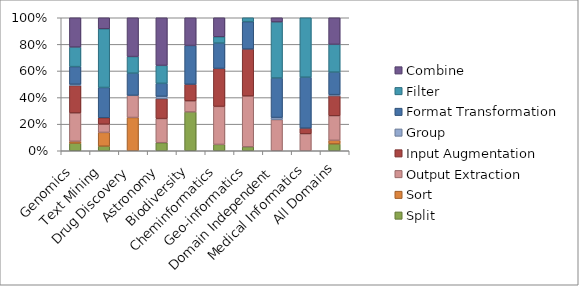
| Category | Split | Sort | Output Extraction | Input Augmentation | Group | Format Transformation | Filter | Combine |
|---|---|---|---|---|---|---|---|---|
| Genomics | 24 | 6 | 90 | 87 | 4 | 56 | 62 | 93 |
| Text Mining | 5 | 15 | 9 | 7 | 0 | 33 | 64 | 12 |
| Drug Discovery | 0 | 6 | 4 | 0 | 0 | 4 | 3 | 7 |
| Astronomy | 13 | 0 | 39 | 32 | 4 | 21 | 29 | 77 |
| Biodiversity | 7 | 0 | 2 | 3 | 0 | 7 | 0 | 5 |
| Cheminformatics | 1 | 0 | 6 | 6 | 0 | 4 | 1 | 3 |
| Geo-informatics | 1 | 0 | 13 | 12 | 0 | 7 | 1 | 0 |
| Domain Independent | 0 | 0 | 15 | 0 | 1 | 19 | 27 | 2 |
| Medical Informatics | 0 | 0 | 6 | 2 | 0 | 18 | 21 | 0 |
| All Domains | 51 | 27 | 184 | 149 | 9 | 169 | 208 | 199 |